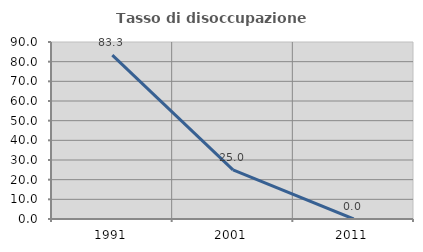
| Category | Tasso di disoccupazione giovanile  |
|---|---|
| 1991.0 | 83.333 |
| 2001.0 | 25 |
| 2011.0 | 0 |